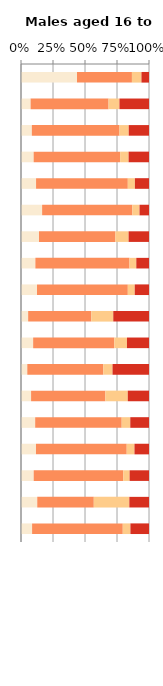
| Category | No qualifications | Below degree level qualifications | Other qualifications | Degree level qualifications |   |
|---|---|---|---|---|---|
| White Gypsy or Irish Traveller | 43.751 | 42.915 | 7.435 | 5.898 |  |
| White Irish | 7.509 | 60.896 | 8.503 | 23.092 |  |
| Bangladeshi | 8.46 | 68.496 | 7.204 | 15.839 |  |
| Pakistani | 9.895 | 67.543 | 6.62 | 15.942 |  |
| White British | 11.766 | 71.685 | 5.534 | 11.015 |  |
| Mixed White & Black Caribbean | 16.506 | 70.487 | 5.608 | 7.399 |  |
| Other | 14.069 | 59.688 | 10.308 | 15.935 |  |
| Black Caribbean | 11.23 | 73.545 | 5.302 | 9.923 |  |
| Other Black | 12.503 | 70.954 | 5.41 | 11.133 |  |
| Chinese | 5.592 | 49.378 | 17.12 | 27.91 |  |
| Other Asian | 9.49 | 63.425 | 9.856 | 17.23 |  |
| Indian | 4.918 | 59.406 | 7.182 | 28.493 |  |
| Arab | 7.875 | 58.073 | 17.479 | 16.573 |  |
| Other Mixed | 11.078 | 67.602 | 6.692 | 14.629 |  |
| Mixed White & Black African | 11.712 | 70.895 | 6.047 | 11.346 |  |
| Mixed White & Asian | 9.917 | 70.017 | 4.921 | 15.144 |  |
| Other White | 12.693 | 44.179 | 27.769 | 15.358 |  |
| Black African | 8.667 | 70.848 | 5.969 | 14.515 |  |